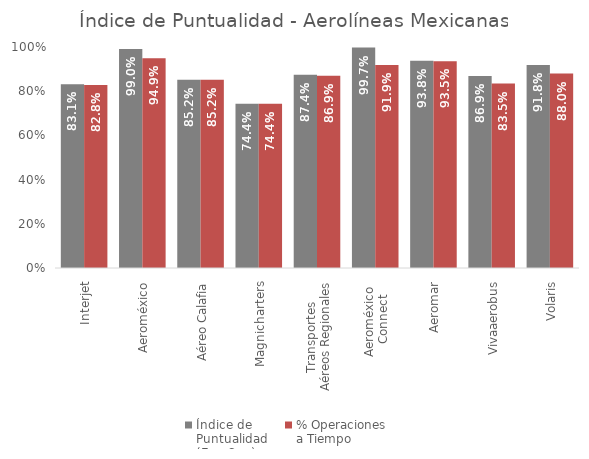
| Category | Índice de 
Puntualidad
(Ene-Sep) | % Operaciones 
a Tiempo |
|---|---|---|
| Interjet | 0.831 | 0.828 |
| Aeroméxico | 0.99 | 0.949 |
| Aéreo Calafia | 0.852 | 0.852 |
| Magnicharters | 0.744 | 0.744 |
| Transportes 
Aéreos Regionales | 0.874 | 0.869 |
| Aeroméxico 
Connect | 0.997 | 0.919 |
| Aeromar | 0.938 | 0.935 |
| Vivaaerobus | 0.869 | 0.835 |
| Volaris | 0.918 | 0.88 |